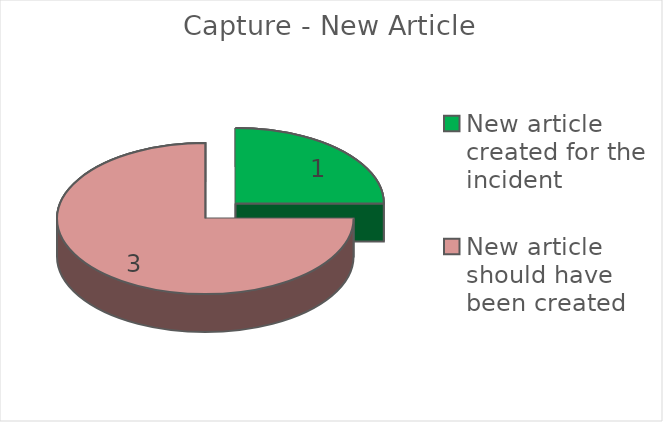
| Category | Series 0 |
|---|---|
| New article created for the incident | 1 |
| New article should have been created | 3 |